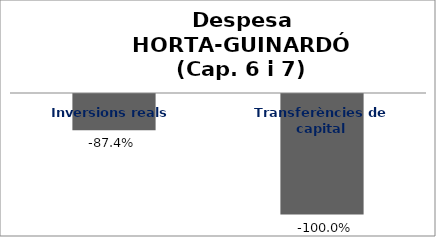
| Category | Series 0 |
|---|---|
| Inversions reals | -0.874 |
| Transferències de capital | -1 |